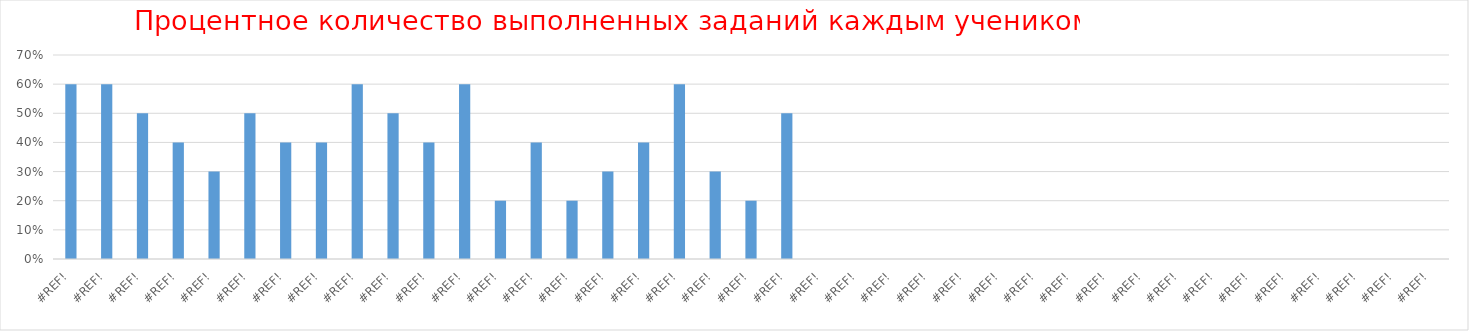
| Category | Series 0 |
|---|---|
| 0.0 | 0.6 |
| 0.0 | 0.6 |
| 0.0 | 0.5 |
| 0.0 | 0.4 |
| 0.0 | 0.3 |
| 0.0 | 0.5 |
| 0.0 | 0.4 |
| 0.0 | 0.4 |
| 0.0 | 0.6 |
| 0.0 | 0.5 |
| 0.0 | 0.4 |
| 0.0 | 0.6 |
| 0.0 | 0.2 |
| 0.0 | 0.4 |
| 0.0 | 0.2 |
| 0.0 | 0.3 |
| 0.0 | 0.4 |
| 0.0 | 0.6 |
| 0.0 | 0.3 |
| 0.0 | 0.2 |
| 0.0 | 0.5 |
| 0.0 | 0 |
| 0.0 | 0 |
| 0.0 | 0 |
| 0.0 | 0 |
| 0.0 | 0 |
| 0.0 | 0 |
| 0.0 | 0 |
| 0.0 | 0 |
| 0.0 | 0 |
| 0.0 | 0 |
| 0.0 | 0 |
| 0.0 | 0 |
| 0.0 | 0 |
| 0.0 | 0 |
| 0.0 | 0 |
| 0.0 | 0 |
| 0.0 | 0 |
| 0.0 | 0 |